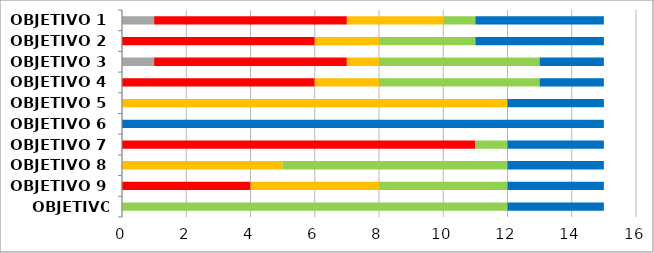
| Category | Series 0 | Series 1 | Series 2 | Series 3 | Series 4 |
|---|---|---|---|---|---|
| OBJETIVO 1 | 1 | 6 | 3 | 1 | 4 |
| OBJETIVO 2 | 0 | 6 | 2 | 3 | 4 |
| OBJETIVO 3 | 1 | 6 | 1 | 5 | 2 |
| OBJETIVO 4 | 0 | 6 | 2 | 5 | 2 |
| OBJETIVO 5 | 0 | 0 | 12 | 0 | 3 |
| OBJETIVO 6 | 0 | 0 | 0 | 0 | 15 |
| OBJETIVO 7 | 0 | 11 | 0 | 1 | 3 |
| OBJETIVO 8 | 0 | 0 | 5 | 7 | 3 |
| OBJETIVO 9 | 0 | 4 | 4 | 4 | 3 |
| OBJETIVO 10 | 0 | 0 | 0 | 12 | 3 |